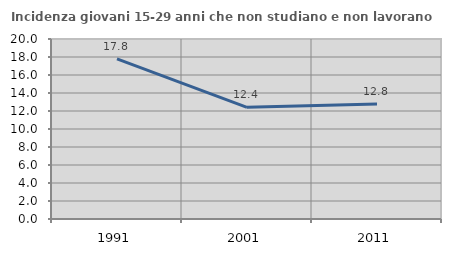
| Category | Incidenza giovani 15-29 anni che non studiano e non lavorano  |
|---|---|
| 1991.0 | 17.801 |
| 2001.0 | 12.403 |
| 2011.0 | 12.766 |